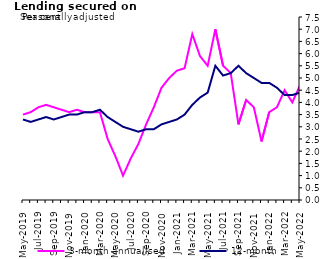
| Category | 3-month annualised | 12-month |
|---|---|---|
| May-2019 | 3.5 | 3.3 |
| Jun-2019 | 3.6 | 3.2 |
| Jul-2019 | 3.8 | 3.3 |
| Aug-2019 | 3.9 | 3.4 |
| Sep-2019 | 3.8 | 3.3 |
| Oct-2019 | 3.7 | 3.4 |
| Nov-2019 | 3.6 | 3.5 |
| Dec-2019 | 3.7 | 3.5 |
| Jan-2020 | 3.6 | 3.6 |
| Feb-2020 | 3.6 | 3.6 |
| Mar-2020 | 3.6 | 3.7 |
| Apr-2020 | 2.5 | 3.4 |
| May-2020 | 1.8 | 3.2 |
| Jun-2020 | 1 | 3 |
| Jul-2020 | 1.7 | 2.9 |
| Aug-2020 | 2.3 | 2.8 |
| Sep-2020 | 3.1 | 2.9 |
| Oct-2020 | 3.8 | 2.9 |
| Nov-2020 | 4.6 | 3.1 |
| Dec-2020 | 5 | 3.2 |
| Jan-2021 | 5.3 | 3.3 |
| Feb-2021 | 5.4 | 3.5 |
| Mar-2021 | 6.8 | 3.9 |
| Apr-2021 | 5.9 | 4.2 |
| May-2021 | 5.5 | 4.4 |
| Jun-2021 | 7 | 5.5 |
| Jul-2021 | 5.5 | 5.1 |
| Aug-2021 | 5.2 | 5.2 |
| Sep-2021 | 3.1 | 5.5 |
| Oct-2021 | 4.1 | 5.2 |
| Nov-2021 | 3.8 | 5 |
| Dec-2021 | 2.4 | 4.8 |
| Jan-2022 | 3.6 | 4.8 |
| Feb-2022 | 3.8 | 4.6 |
| Mar-2022 | 4.5 | 4.3 |
| Apr-2022 | 4 | 4.3 |
| May-2022 | 4.7 | 4.4 |